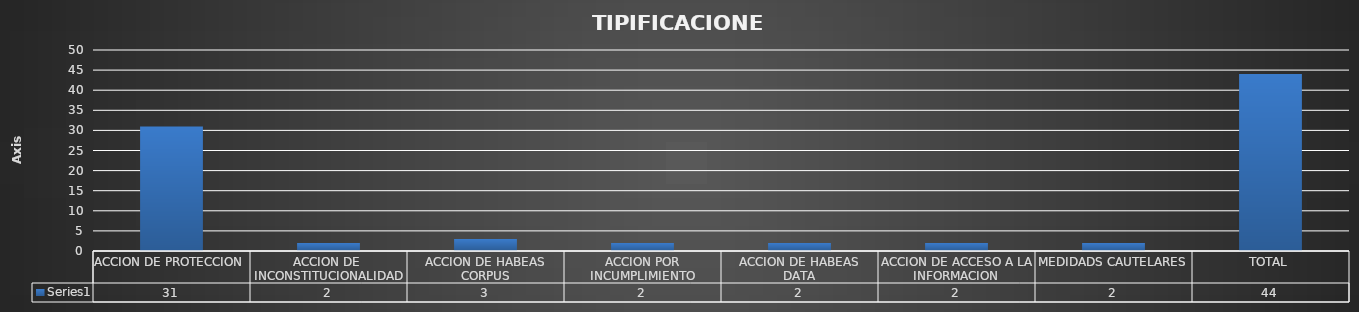
| Category | Series 0 |
|---|---|
| ACCION DE PROTECCION | 31 |
| ACCION DE  INCONSTITUCIONALIDAD | 2 |
| ACCION DE HABEAS CORPUS | 3 |
| ACCION POR INCUMPLIMIENTO | 2 |
| ACCION DE HABEAS DATA | 2 |
| ACCION DE ACCESO A LA INFORMACION | 2 |
| MEDIDADS CAUTELARES | 2 |
| TOTAL | 44 |